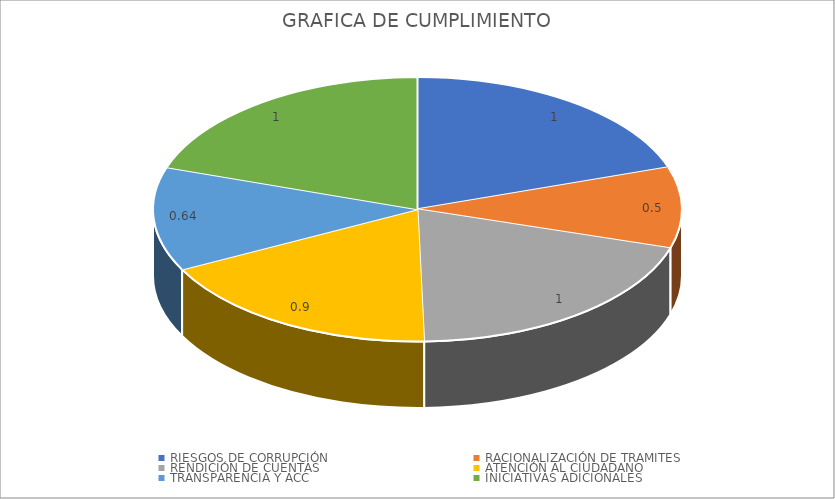
| Category | Series 0 |
|---|---|
| RIESGOS DE CORRUPCIÓN | 1 |
| RACIONALIZACIÓN DE TRAMITES | 0.5 |
| RENDICIÓN DE CUENTAS | 1 |
| ATENCIÓN AL CIUDADANO | 0.9 |
| TRANSPARENCIA Y ACC | 0.64 |
| INICIATIVAS ADICIONALES | 1 |